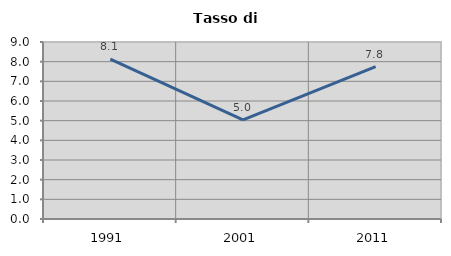
| Category | Tasso di disoccupazione   |
|---|---|
| 1991.0 | 8.125 |
| 2001.0 | 5.038 |
| 2011.0 | 7.751 |